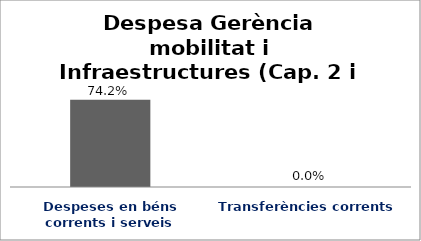
| Category | Series 0 |
|---|---|
| Despeses en béns corrents i serveis | 0.742 |
| Transferències corrents | 0 |